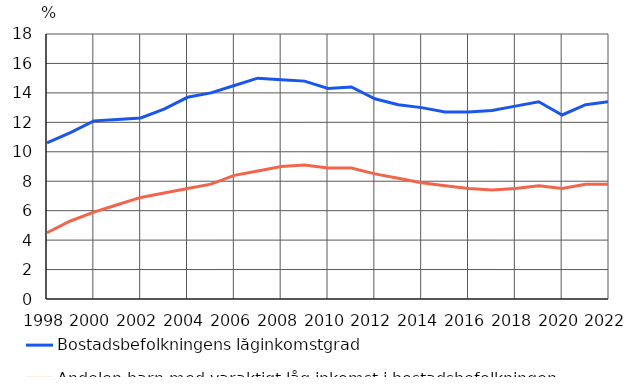
| Category | Bostadsbefolkningens låginkomstgrad | Andelen barn med varaktigt låg inkomst i bostadsbefolkningen 1) |
|---|---|---|
| 1998 | 10.6 | 4.5 |
| 1999 | 11.3 | 5.3 |
| 2000 | 12.1 | 5.9 |
| 2001 | 12.2 | 6.4 |
| 2002 | 12.3 | 6.9 |
| 2003 | 12.9 | 7.2 |
| 2004 | 13.7 | 7.5 |
| 2005 | 14 | 7.8 |
| 2006 | 14.5 | 8.4 |
| 2007 | 15 | 8.7 |
| 2008 | 14.9 | 9 |
| 2009 | 14.8 | 9.1 |
| 2010 | 14.3 | 8.9 |
| 2011 | 14.4 | 8.9 |
| 2012 | 13.6 | 8.5 |
| 2013 | 13.2 | 8.2 |
| 2014 | 13 | 7.9 |
| 2015 | 12.7 | 7.7 |
| 2016 | 12.7 | 7.5 |
| 2017 | 12.8 | 7.4 |
| 2018 | 13.1 | 7.5 |
| 2019 | 13.4 | 7.7 |
| 2020 | 12.5 | 7.5 |
| 2021 | 13.2 | 7.8 |
| 2022 | 13.4 | 7.8 |